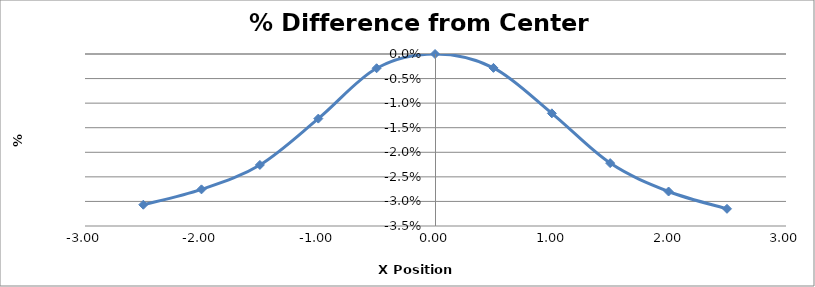
| Category | Series 0 |
|---|---|
| -2.5010000000000003 | -0.031 |
| -2.003 | -0.028 |
| -1.5030000000000001 | -0.023 |
| -1.0030000000000001 | -0.013 |
| -0.5040000000000004 | -0.003 |
| -0.004000000000000448 | 0 |
| 0.49599999999999955 | -0.003 |
| 0.9959999999999996 | -0.012 |
| 1.495 | -0.022 |
| 1.995 | -0.028 |
| 2.495 | -0.032 |